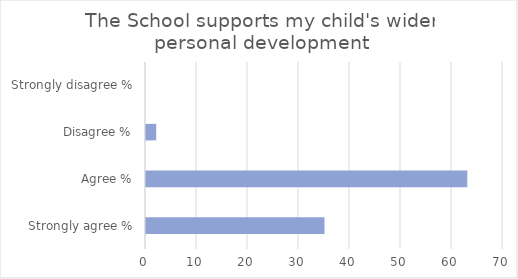
| Category | Series 1 |
|---|---|
| Strongly agree % | 35 |
| Agree % | 63 |
| Disagree % | 2 |
| Strongly disagree % | 0 |